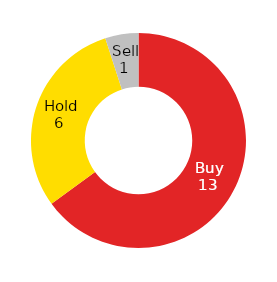
| Category | Series 0 |
|---|---|
| Buy | 13 |
| Hold | 6 |
| Sell | 1 |